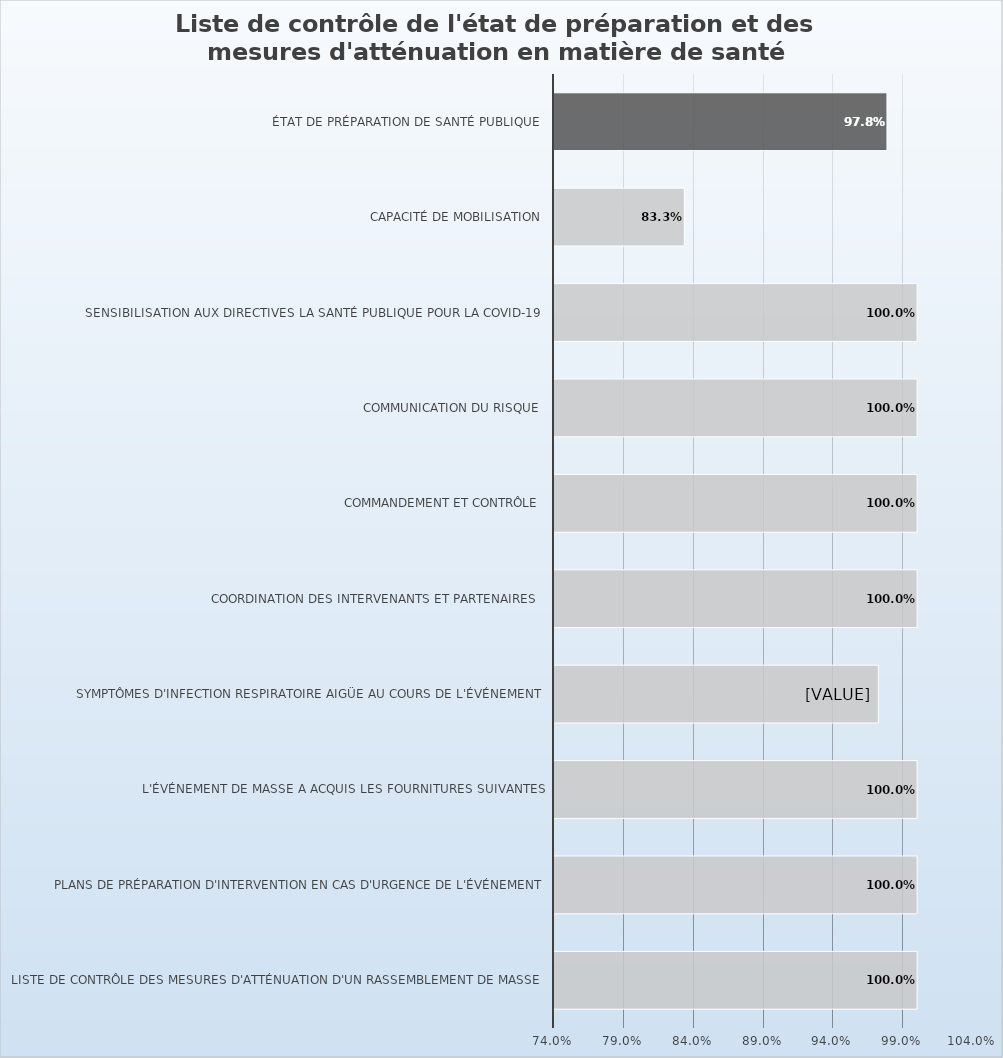
| Category | Series 4 |
|---|---|
| Liste de contrôle des mesures d'atténuation d'un rassemblement de masse  | 1 |
| Plans de préparation d'intervention en cas d'urgence de l'événement | 1 |
|  L'événement de masse a acquis les fournitures suivantes | 1 |
|  Symptômes d'infection respiratoire aigüe au cours de l'événement | 0.972 |
| Coordination des intervenants et partenaires  | 1 |
| Commandement et contrôle | 1 |
| Communication du risque | 1 |
| Sensibilisation aux directives la santé publique pour la COVID-19  | 1 |
| Capacité de mobilisation | 0.833 |
| État de préparation de santé publique | 0.978 |